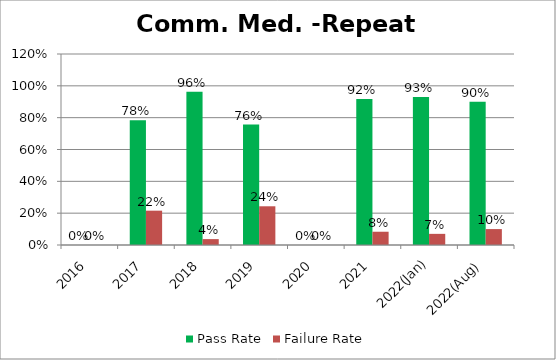
| Category | Pass Rate | Failure Rate |
|---|---|---|
| 2016 | 0 | 0 |
| 2017 | 0.784 | 0.216 |
| 2018 | 0.963 | 0.037 |
| 2019 | 0.757 | 0.243 |
| 2020 | 0 | 0 |
| 2021 | 0.917 | 0.083 |
| 2022(Jan) | 0.93 | 0.07 |
| 2022(Aug) | 0.9 | 0.1 |